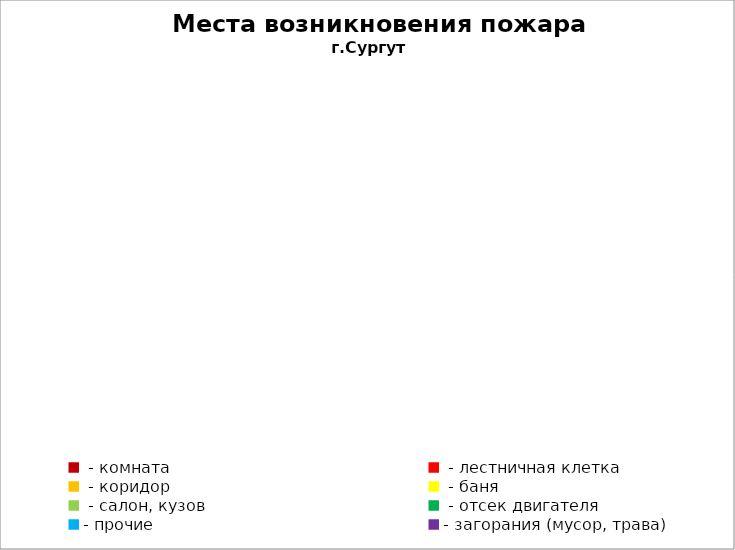
| Category | Места возникновения пожара |
|---|---|
|  - комната | 67 |
|  - лестничная клетка | 12 |
|  - коридор | 7 |
|  - баня | 36 |
|  - салон, кузов | 16 |
|  - отсек двигателя | 41 |
| - прочие | 117 |
| - загорания (мусор, трава)  | 40 |